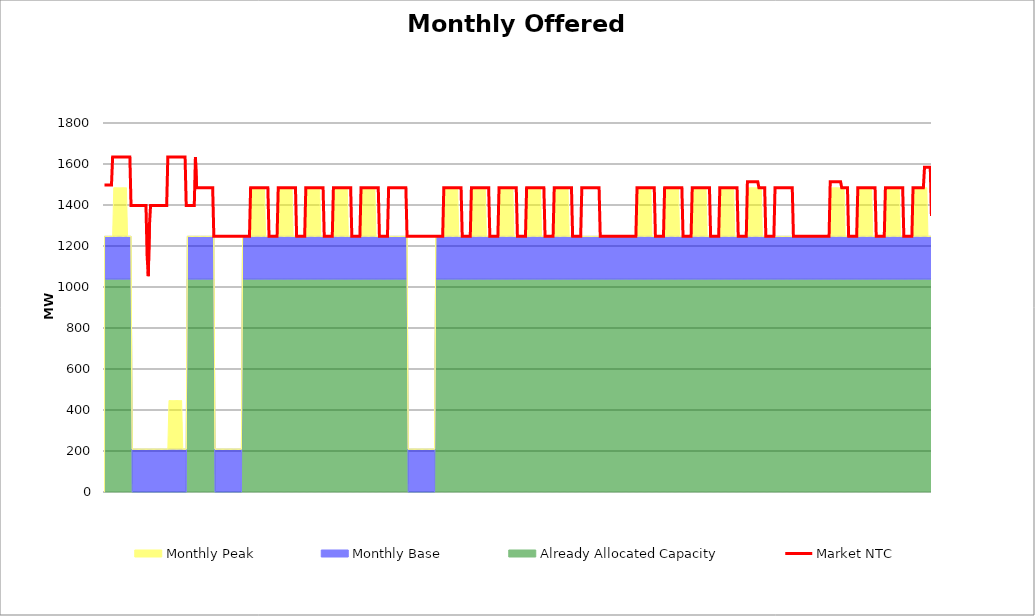
| Category | Market NTC |
|---|---|
| 0 | 1497 |
| 1 | 1497 |
| 2 | 1497 |
| 3 | 1497 |
| 4 | 1497 |
| 5 | 1497 |
| 6 | 1497 |
| 7 | 1634 |
| 8 | 1634 |
| 9 | 1634 |
| 10 | 1634 |
| 11 | 1634 |
| 12 | 1634 |
| 13 | 1634 |
| 14 | 1634 |
| 15 | 1634 |
| 16 | 1634 |
| 17 | 1634 |
| 18 | 1634 |
| 19 | 1634 |
| 20 | 1634 |
| 21 | 1634 |
| 22 | 1634 |
| 23 | 1397 |
| 24 | 1397 |
| 25 | 1397 |
| 26 | 1397 |
| 27 | 1397 |
| 28 | 1397 |
| 29 | 1397 |
| 30 | 1397 |
| 31 | 1397 |
| 32 | 1397 |
| 33 | 1397 |
| 34 | 1397 |
| 35 | 1397 |
| 36 | 1397 |
| 37 | 1151 |
| 38 | 1053 |
| 39 | 1299 |
| 40 | 1397 |
| 41 | 1397 |
| 42 | 1397 |
| 43 | 1397 |
| 44 | 1397 |
| 45 | 1397 |
| 46 | 1397 |
| 47 | 1397 |
| 48 | 1397 |
| 49 | 1397 |
| 50 | 1397 |
| 51 | 1397 |
| 52 | 1397 |
| 53 | 1397 |
| 54 | 1397 |
| 55 | 1634 |
| 56 | 1634 |
| 57 | 1634 |
| 58 | 1634 |
| 59 | 1634 |
| 60 | 1634 |
| 61 | 1634 |
| 62 | 1634 |
| 63 | 1634 |
| 64 | 1634 |
| 65 | 1634 |
| 66 | 1634 |
| 67 | 1634 |
| 68 | 1634 |
| 69 | 1634 |
| 70 | 1634 |
| 71 | 1397 |
| 72 | 1397 |
| 73 | 1397 |
| 74 | 1397 |
| 75 | 1397 |
| 76 | 1397 |
| 77 | 1397 |
| 78 | 1397 |
| 79 | 1634 |
| 80 | 1484 |
| 81 | 1484 |
| 82 | 1484 |
| 83 | 1484 |
| 84 | 1484 |
| 85 | 1484 |
| 86 | 1484 |
| 87 | 1484 |
| 88 | 1484 |
| 89 | 1484 |
| 90 | 1484 |
| 91 | 1484 |
| 92 | 1484 |
| 93 | 1484 |
| 94 | 1484 |
| 95 | 1247 |
| 96 | 1247 |
| 97 | 1247 |
| 98 | 1247 |
| 99 | 1247 |
| 100 | 1247 |
| 101 | 1247 |
| 102 | 1247 |
| 103 | 1247 |
| 104 | 1247 |
| 105 | 1247 |
| 106 | 1247 |
| 107 | 1247 |
| 108 | 1247 |
| 109 | 1247 |
| 110 | 1247 |
| 111 | 1247 |
| 112 | 1247 |
| 113 | 1247 |
| 114 | 1247 |
| 115 | 1247 |
| 116 | 1247 |
| 117 | 1247 |
| 118 | 1247 |
| 119 | 1247 |
| 120 | 1247 |
| 121 | 1247 |
| 122 | 1247 |
| 123 | 1247 |
| 124 | 1247 |
| 125 | 1247 |
| 126 | 1247 |
| 127 | 1484 |
| 128 | 1484 |
| 129 | 1484 |
| 130 | 1484 |
| 131 | 1484 |
| 132 | 1484 |
| 133 | 1484 |
| 134 | 1484 |
| 135 | 1484 |
| 136 | 1484 |
| 137 | 1484 |
| 138 | 1484 |
| 139 | 1484 |
| 140 | 1484 |
| 141 | 1484 |
| 142 | 1484 |
| 143 | 1247 |
| 144 | 1247 |
| 145 | 1247 |
| 146 | 1247 |
| 147 | 1247 |
| 148 | 1247 |
| 149 | 1247 |
| 150 | 1247 |
| 151 | 1484 |
| 152 | 1484 |
| 153 | 1484 |
| 154 | 1484 |
| 155 | 1484 |
| 156 | 1484 |
| 157 | 1484 |
| 158 | 1484 |
| 159 | 1484 |
| 160 | 1484 |
| 161 | 1484 |
| 162 | 1484 |
| 163 | 1484 |
| 164 | 1484 |
| 165 | 1484 |
| 166 | 1484 |
| 167 | 1247 |
| 168 | 1247 |
| 169 | 1247 |
| 170 | 1247 |
| 171 | 1247 |
| 172 | 1247 |
| 173 | 1247 |
| 174 | 1247 |
| 175 | 1484 |
| 176 | 1484 |
| 177 | 1484 |
| 178 | 1484 |
| 179 | 1484 |
| 180 | 1484 |
| 181 | 1484 |
| 182 | 1484 |
| 183 | 1484 |
| 184 | 1484 |
| 185 | 1484 |
| 186 | 1484 |
| 187 | 1484 |
| 188 | 1484 |
| 189 | 1484 |
| 190 | 1484 |
| 191 | 1247 |
| 192 | 1247 |
| 193 | 1247 |
| 194 | 1247 |
| 195 | 1247 |
| 196 | 1247 |
| 197 | 1247 |
| 198 | 1247 |
| 199 | 1484 |
| 200 | 1484 |
| 201 | 1484 |
| 202 | 1484 |
| 203 | 1484 |
| 204 | 1484 |
| 205 | 1484 |
| 206 | 1484 |
| 207 | 1484 |
| 208 | 1484 |
| 209 | 1484 |
| 210 | 1484 |
| 211 | 1484 |
| 212 | 1484 |
| 213 | 1484 |
| 214 | 1484 |
| 215 | 1247 |
| 216 | 1247 |
| 217 | 1247 |
| 218 | 1247 |
| 219 | 1247 |
| 220 | 1247 |
| 221 | 1247 |
| 222 | 1247 |
| 223 | 1484 |
| 224 | 1484 |
| 225 | 1484 |
| 226 | 1484 |
| 227 | 1484 |
| 228 | 1484 |
| 229 | 1484 |
| 230 | 1484 |
| 231 | 1484 |
| 232 | 1484 |
| 233 | 1484 |
| 234 | 1484 |
| 235 | 1484 |
| 236 | 1484 |
| 237 | 1484 |
| 238 | 1484 |
| 239 | 1247 |
| 240 | 1247 |
| 241 | 1247 |
| 242 | 1247 |
| 243 | 1247 |
| 244 | 1247 |
| 245 | 1247 |
| 246 | 1247 |
| 247 | 1484 |
| 248 | 1484 |
| 249 | 1484 |
| 250 | 1484 |
| 251 | 1484 |
| 252 | 1484 |
| 253 | 1484 |
| 254 | 1484 |
| 255 | 1484 |
| 256 | 1484 |
| 257 | 1484 |
| 258 | 1484 |
| 259 | 1484 |
| 260 | 1484 |
| 261 | 1484 |
| 262 | 1484 |
| 263 | 1247 |
| 264 | 1247 |
| 265 | 1247 |
| 266 | 1247 |
| 267 | 1247 |
| 268 | 1247 |
| 269 | 1247 |
| 270 | 1247 |
| 271 | 1247 |
| 272 | 1247 |
| 273 | 1247 |
| 274 | 1247 |
| 275 | 1247 |
| 276 | 1247 |
| 277 | 1247 |
| 278 | 1247 |
| 279 | 1247 |
| 280 | 1247 |
| 281 | 1247 |
| 282 | 1247 |
| 283 | 1247 |
| 284 | 1247 |
| 285 | 1247 |
| 286 | 1247 |
| 287 | 1247 |
| 288 | 1247 |
| 289 | 1247 |
| 290 | 1247 |
| 291 | 1247 |
| 292 | 1247 |
| 293 | 1247 |
| 294 | 1247 |
| 295 | 1484 |
| 296 | 1484 |
| 297 | 1484 |
| 298 | 1484 |
| 299 | 1484 |
| 300 | 1484 |
| 301 | 1484 |
| 302 | 1484 |
| 303 | 1484 |
| 304 | 1484 |
| 305 | 1484 |
| 306 | 1484 |
| 307 | 1484 |
| 308 | 1484 |
| 309 | 1484 |
| 310 | 1484 |
| 311 | 1247 |
| 312 | 1247 |
| 313 | 1247 |
| 314 | 1247 |
| 315 | 1247 |
| 316 | 1247 |
| 317 | 1247 |
| 318 | 1247 |
| 319 | 1484 |
| 320 | 1484 |
| 321 | 1484 |
| 322 | 1484 |
| 323 | 1484 |
| 324 | 1484 |
| 325 | 1484 |
| 326 | 1484 |
| 327 | 1484 |
| 328 | 1484 |
| 329 | 1484 |
| 330 | 1484 |
| 331 | 1484 |
| 332 | 1484 |
| 333 | 1484 |
| 334 | 1484 |
| 335 | 1247 |
| 336 | 1247 |
| 337 | 1247 |
| 338 | 1247 |
| 339 | 1247 |
| 340 | 1247 |
| 341 | 1247 |
| 342 | 1247 |
| 343 | 1484 |
| 344 | 1484 |
| 345 | 1484 |
| 346 | 1484 |
| 347 | 1484 |
| 348 | 1484 |
| 349 | 1484 |
| 350 | 1484 |
| 351 | 1484 |
| 352 | 1484 |
| 353 | 1484 |
| 354 | 1484 |
| 355 | 1484 |
| 356 | 1484 |
| 357 | 1484 |
| 358 | 1484 |
| 359 | 1247 |
| 360 | 1247 |
| 361 | 1247 |
| 362 | 1247 |
| 363 | 1247 |
| 364 | 1247 |
| 365 | 1247 |
| 366 | 1247 |
| 367 | 1484 |
| 368 | 1484 |
| 369 | 1484 |
| 370 | 1484 |
| 371 | 1484 |
| 372 | 1484 |
| 373 | 1484 |
| 374 | 1484 |
| 375 | 1484 |
| 376 | 1484 |
| 377 | 1484 |
| 378 | 1484 |
| 379 | 1484 |
| 380 | 1484 |
| 381 | 1484 |
| 382 | 1484 |
| 383 | 1247 |
| 384 | 1247 |
| 385 | 1247 |
| 386 | 1247 |
| 387 | 1247 |
| 388 | 1247 |
| 389 | 1247 |
| 390 | 1247 |
| 391 | 1484 |
| 392 | 1484 |
| 393 | 1484 |
| 394 | 1484 |
| 395 | 1484 |
| 396 | 1484 |
| 397 | 1484 |
| 398 | 1484 |
| 399 | 1484 |
| 400 | 1484 |
| 401 | 1484 |
| 402 | 1484 |
| 403 | 1484 |
| 404 | 1484 |
| 405 | 1484 |
| 406 | 1484 |
| 407 | 1247 |
| 408 | 1247 |
| 409 | 1247 |
| 410 | 1247 |
| 411 | 1247 |
| 412 | 1247 |
| 413 | 1247 |
| 414 | 1247 |
| 415 | 1484 |
| 416 | 1484 |
| 417 | 1484 |
| 418 | 1484 |
| 419 | 1484 |
| 420 | 1484 |
| 421 | 1484 |
| 422 | 1484 |
| 423 | 1484 |
| 424 | 1484 |
| 425 | 1484 |
| 426 | 1484 |
| 427 | 1484 |
| 428 | 1484 |
| 429 | 1484 |
| 430 | 1484 |
| 431 | 1247 |
| 432 | 1247 |
| 433 | 1247 |
| 434 | 1247 |
| 435 | 1247 |
| 436 | 1247 |
| 437 | 1247 |
| 438 | 1247 |
| 439 | 1247 |
| 440 | 1247 |
| 441 | 1247 |
| 442 | 1247 |
| 443 | 1247 |
| 444 | 1247 |
| 445 | 1247 |
| 446 | 1247 |
| 447 | 1247 |
| 448 | 1247 |
| 449 | 1247 |
| 450 | 1247 |
| 451 | 1247 |
| 452 | 1247 |
| 453 | 1247 |
| 454 | 1247 |
| 455 | 1247 |
| 456 | 1247 |
| 457 | 1247 |
| 458 | 1247 |
| 459 | 1247 |
| 460 | 1247 |
| 461 | 1247 |
| 462 | 1247 |
| 463 | 1484 |
| 464 | 1484 |
| 465 | 1484 |
| 466 | 1484 |
| 467 | 1484 |
| 468 | 1484 |
| 469 | 1484 |
| 470 | 1484 |
| 471 | 1484 |
| 472 | 1484 |
| 473 | 1484 |
| 474 | 1484 |
| 475 | 1484 |
| 476 | 1484 |
| 477 | 1484 |
| 478 | 1484 |
| 479 | 1247 |
| 480 | 1247 |
| 481 | 1247 |
| 482 | 1247 |
| 483 | 1247 |
| 484 | 1247 |
| 485 | 1247 |
| 486 | 1247 |
| 487 | 1484 |
| 488 | 1484 |
| 489 | 1484 |
| 490 | 1484 |
| 491 | 1484 |
| 492 | 1484 |
| 493 | 1484 |
| 494 | 1484 |
| 495 | 1484 |
| 496 | 1484 |
| 497 | 1484 |
| 498 | 1484 |
| 499 | 1484 |
| 500 | 1484 |
| 501 | 1484 |
| 502 | 1484 |
| 503 | 1247 |
| 504 | 1247 |
| 505 | 1247 |
| 506 | 1247 |
| 507 | 1247 |
| 508 | 1247 |
| 509 | 1247 |
| 510 | 1247 |
| 511 | 1484 |
| 512 | 1484 |
| 513 | 1484 |
| 514 | 1484 |
| 515 | 1484 |
| 516 | 1484 |
| 517 | 1484 |
| 518 | 1484 |
| 519 | 1484 |
| 520 | 1484 |
| 521 | 1484 |
| 522 | 1484 |
| 523 | 1484 |
| 524 | 1484 |
| 525 | 1484 |
| 526 | 1484 |
| 527 | 1247 |
| 528 | 1247 |
| 529 | 1247 |
| 530 | 1247 |
| 531 | 1247 |
| 532 | 1247 |
| 533 | 1247 |
| 534 | 1247 |
| 535 | 1484 |
| 536 | 1484 |
| 537 | 1484 |
| 538 | 1484 |
| 539 | 1484 |
| 540 | 1484 |
| 541 | 1484 |
| 542 | 1484 |
| 543 | 1484 |
| 544 | 1484 |
| 545 | 1484 |
| 546 | 1484 |
| 547 | 1484 |
| 548 | 1484 |
| 549 | 1484 |
| 550 | 1484 |
| 551 | 1247 |
| 552 | 1247 |
| 553 | 1247 |
| 554 | 1247 |
| 555 | 1247 |
| 556 | 1247 |
| 557 | 1247 |
| 558 | 1247 |
| 559 | 1514 |
| 560 | 1514 |
| 561 | 1514 |
| 562 | 1514 |
| 563 | 1514 |
| 564 | 1514 |
| 565 | 1514 |
| 566 | 1514 |
| 567 | 1514 |
| 568 | 1514 |
| 569 | 1484 |
| 570 | 1484 |
| 571 | 1484 |
| 572 | 1484 |
| 573 | 1484 |
| 574 | 1484 |
| 575 | 1247 |
| 576 | 1247 |
| 577 | 1247 |
| 578 | 1247 |
| 579 | 1247 |
| 580 | 1247 |
| 581 | 1247 |
| 582 | 1247 |
| 583 | 1484 |
| 584 | 1484 |
| 585 | 1484 |
| 586 | 1484 |
| 587 | 1484 |
| 588 | 1484 |
| 589 | 1484 |
| 590 | 1484 |
| 591 | 1484 |
| 592 | 1484 |
| 593 | 1484 |
| 594 | 1484 |
| 595 | 1484 |
| 596 | 1484 |
| 597 | 1484 |
| 598 | 1484 |
| 599 | 1247 |
| 600 | 1247 |
| 601 | 1247 |
| 602 | 1247 |
| 603 | 1247 |
| 604 | 1247 |
| 605 | 1247 |
| 606 | 1247 |
| 607 | 1247 |
| 608 | 1247 |
| 609 | 1247 |
| 610 | 1247 |
| 611 | 1247 |
| 612 | 1247 |
| 613 | 1247 |
| 614 | 1247 |
| 615 | 1247 |
| 616 | 1247 |
| 617 | 1247 |
| 618 | 1247 |
| 619 | 1247 |
| 620 | 1247 |
| 621 | 1247 |
| 622 | 1247 |
| 623 | 1247 |
| 624 | 1247 |
| 625 | 1247 |
| 626 | 1247 |
| 627 | 1247 |
| 628 | 1247 |
| 629 | 1247 |
| 630 | 1247 |
| 631 | 1514 |
| 632 | 1514 |
| 633 | 1514 |
| 634 | 1514 |
| 635 | 1514 |
| 636 | 1514 |
| 637 | 1514 |
| 638 | 1514 |
| 639 | 1514 |
| 640 | 1514 |
| 641 | 1484 |
| 642 | 1484 |
| 643 | 1484 |
| 644 | 1484 |
| 645 | 1484 |
| 646 | 1484 |
| 647 | 1247 |
| 648 | 1247 |
| 649 | 1247 |
| 650 | 1247 |
| 651 | 1247 |
| 652 | 1247 |
| 653 | 1247 |
| 654 | 1247 |
| 655 | 1484 |
| 656 | 1484 |
| 657 | 1484 |
| 658 | 1484 |
| 659 | 1484 |
| 660 | 1484 |
| 661 | 1484 |
| 662 | 1484 |
| 663 | 1484 |
| 664 | 1484 |
| 665 | 1484 |
| 666 | 1484 |
| 667 | 1484 |
| 668 | 1484 |
| 669 | 1484 |
| 670 | 1484 |
| 671 | 1247 |
| 672 | 1247 |
| 673 | 1247 |
| 674 | 1247 |
| 675 | 1247 |
| 676 | 1247 |
| 677 | 1247 |
| 678 | 1247 |
| 679 | 1484 |
| 680 | 1484 |
| 681 | 1484 |
| 682 | 1484 |
| 683 | 1484 |
| 684 | 1484 |
| 685 | 1484 |
| 686 | 1484 |
| 687 | 1484 |
| 688 | 1484 |
| 689 | 1484 |
| 690 | 1484 |
| 691 | 1484 |
| 692 | 1484 |
| 693 | 1484 |
| 694 | 1484 |
| 695 | 1247 |
| 696 | 1247 |
| 697 | 1247 |
| 698 | 1247 |
| 699 | 1247 |
| 700 | 1247 |
| 701 | 1247 |
| 702 | 1247 |
| 703 | 1484 |
| 704 | 1484 |
| 705 | 1484 |
| 706 | 1484 |
| 707 | 1484 |
| 708 | 1484 |
| 709 | 1484 |
| 710 | 1484 |
| 711 | 1484 |
| 712 | 1484 |
| 713 | 1584 |
| 714 | 1584 |
| 715 | 1584 |
| 716 | 1584 |
| 717 | 1584 |
| 718 | 1584 |
| 719 | 1347 |